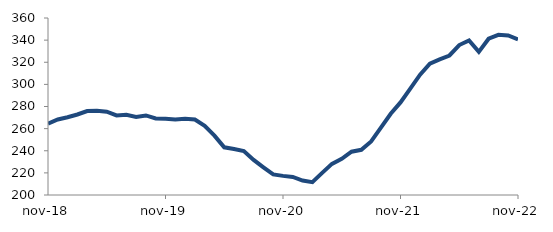
| Category | Series 0 |
|---|---|
| 2018-11-01 | 264.559 |
| 2018-12-01 | 268.288 |
| 2019-01-01 | 270.264 |
| 2019-02-01 | 272.765 |
| 2019-03-01 | 275.922 |
| 2019-04-01 | 276.17 |
| 2019-05-01 | 275.323 |
| 2019-06-01 | 271.933 |
| 2019-07-01 | 272.528 |
| 2019-08-01 | 270.617 |
| 2019-09-01 | 271.909 |
| 2019-10-01 | 269.246 |
| 2019-11-01 | 268.873 |
| 2019-12-01 | 268.319 |
| 2020-01-01 | 268.914 |
| 2020-02-01 | 268.233 |
| 2020-03-01 | 262.58 |
| 2020-04-01 | 253.663 |
| 2020-05-01 | 243.088 |
| 2020-06-01 | 241.541 |
| 2020-07-01 | 239.786 |
| 2020-08-01 | 231.766 |
| 2020-09-01 | 225.047 |
| 2020-10-01 | 218.571 |
| 2020-11-01 | 217.286 |
| 2020-12-01 | 216.368 |
| 2021-01-01 | 213.087 |
| 2021-02-01 | 211.643 |
| 2021-03-01 | 220.04 |
| 2021-04-01 | 228.12 |
| 2021-05-01 | 232.717 |
| 2021-06-01 | 239.097 |
| 2021-07-01 | 240.846 |
| 2021-08-01 | 248.449 |
| 2021-09-01 | 260.934 |
| 2021-10-01 | 273.441 |
| 2021-11-01 | 283.683 |
| 2021-12-01 | 296.134 |
| 2022-01-01 | 308.804 |
| 2022-02-01 | 318.726 |
| 2022-03-01 | 322.592 |
| 2022-04-01 | 326.114 |
| 2022-05-01 | 335.557 |
| 2022-06-01 | 339.684 |
| 2022-07-01 | 329.357 |
| 2022-08-01 | 341.293 |
| 2022-09-01 | 344.793 |
| 2022-10-01 | 344.185 |
| 2022-11-01 | 340.608 |